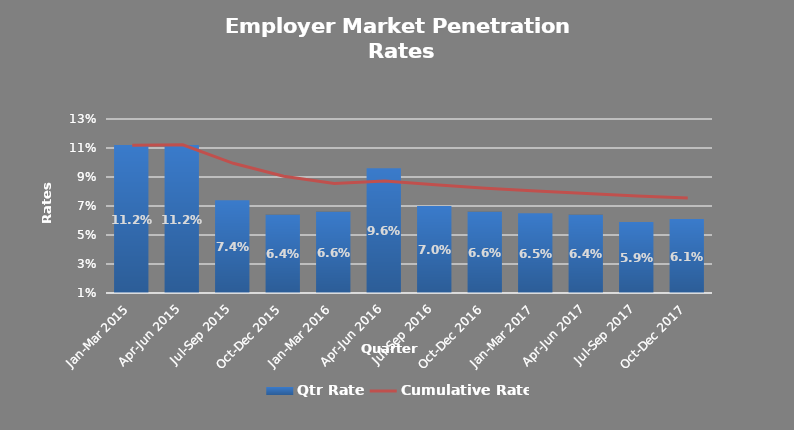
| Category | Qtr Rate |
|---|---|
| Jan-Mar 2015 | 0.112 |
| Apr-Jun 2015 | 0.112 |
| Jul-Sep 2015 | 0.074 |
| Oct-Dec 2015 | 0.064 |
| Jan-Mar 2016 | 0.066 |
| Apr-Jun 2016 | 0.096 |
| Jul-Sep 2016 | 0.07 |
| Oct-Dec 2016 | 0.066 |
| Jan-Mar 2017 | 0.065 |
| Apr-Jun 2017 | 0.064 |
| Jul-Sep 2017 | 0.059 |
| Oct-Dec 2017 | 0.061 |